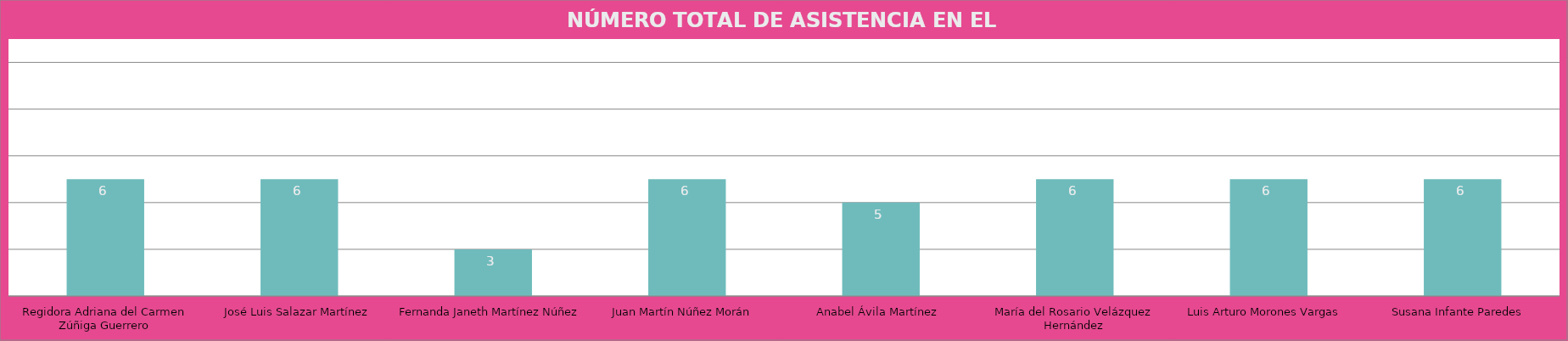
| Category | Regidora Adriana del Carmen Zúñiga Guerrero |
|---|---|
| Regidora Adriana del Carmen Zúñiga Guerrero | 6 |
| José Luis Salazar Martínez | 6 |
| Fernanda Janeth Martínez Núñez | 3 |
| Juan Martín Núñez Morán  | 6 |
| Anabel Ávila Martínez  | 5 |
| María del Rosario Velázquez Hernández | 6 |
| Luis Arturo Morones Vargas  | 6 |
| Susana Infante Paredes  | 6 |